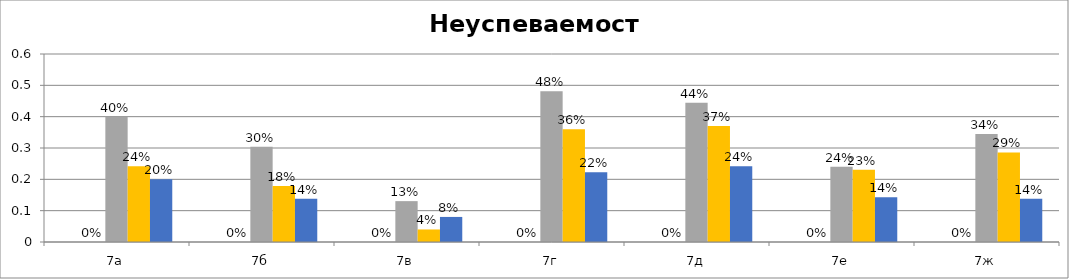
| Category | Series 0 | Series 1 | Series 2 | Series 3 | Series 4 |
|---|---|---|---|---|---|
| 7а |  | 0 | 0.4 | 0.241 | 0.2 |
| 7б |  | 0 | 0.304 | 0.179 | 0.138 |
| 7в |  | 0 | 0.13 | 0.04 | 0.08 |
| 7г |  | 0 | 0.481 | 0.36 | 0.222 |
| 7д |  | 0 | 0.444 | 0.37 | 0.241 |
| 7е |  | 0 | 0.24 | 0.231 | 0.143 |
| 7ж |  | 0 | 0.345 | 0.286 | 0.138 |